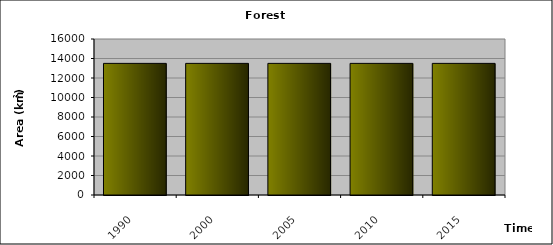
| Category | Series 0 |
|---|---|
| 1990.0 | 13500 |
| 2000.0 | 13500 |
| 2005.0 | 13500 |
| 2010.0 | 13500 |
| 2015.0 | 13500 |